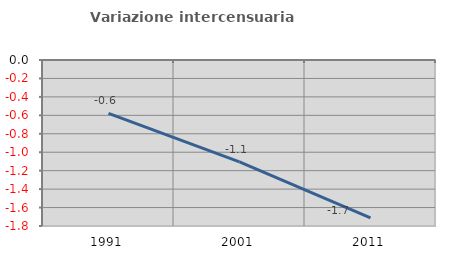
| Category | Variazione intercensuaria annua |
|---|---|
| 1991.0 | -0.58 |
| 2001.0 | -1.104 |
| 2011.0 | -1.712 |